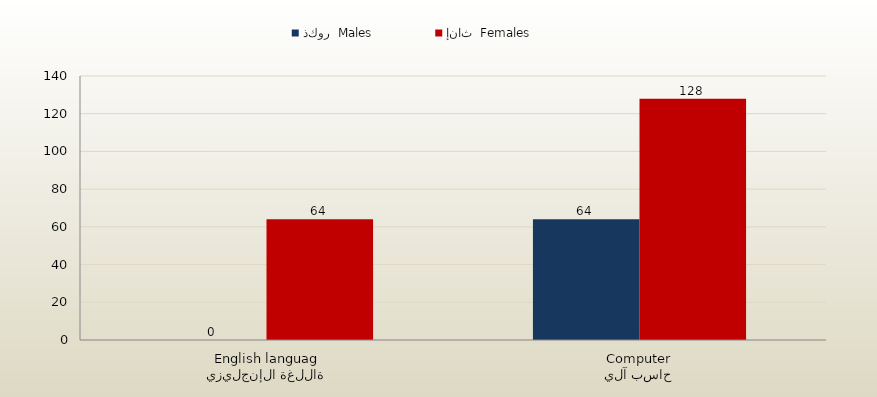
| Category | ذكور  Males | إناث  Females |
|---|---|---|
| اللغة الإنجليزية
English language | 0 | 64 |
| حاسب آلي
Computer | 64 | 128 |